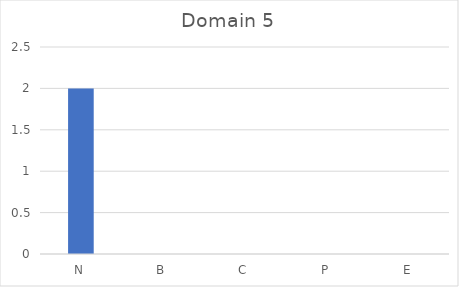
| Category | Series 0 |
|---|---|
| N | 2 |
| B | 0 |
| C | 0 |
| P | 0 |
| E | 0 |